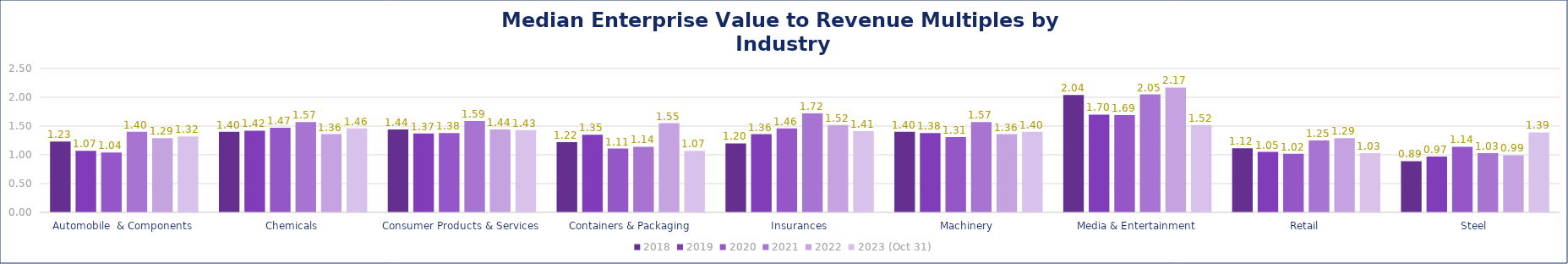
| Category | 2018 | 2019 | 2020 | 2021 | 2022 | 2023 (Oct 31) |
|---|---|---|---|---|---|---|
| Automobile  & Components | 1.23 | 1.07 | 1.04 | 1.4 | 1.29 | 1.32 |
| Chemicals | 1.4 | 1.42 | 1.47 | 1.57 | 1.36 | 1.46 |
| Consumer Products & Services | 1.44 | 1.37 | 1.38 | 1.59 | 1.44 | 1.43 |
| Containers & Packaging | 1.22 | 1.35 | 1.11 | 1.14 | 1.55 | 1.07 |
| Insurances | 1.2 | 1.36 | 1.46 | 1.72 | 1.52 | 1.41 |
| Machinery | 1.4 | 1.38 | 1.31 | 1.57 | 1.36 | 1.4 |
| Media & Entertainment | 2.04 | 1.7 | 1.69 | 2.05 | 2.17 | 1.52 |
| Retail | 1.115 | 1.05 | 1.02 | 1.25 | 1.29 | 1.03 |
| Steel | 0.89 | 0.97 | 1.14 | 1.03 | 0.994 | 1.39 |